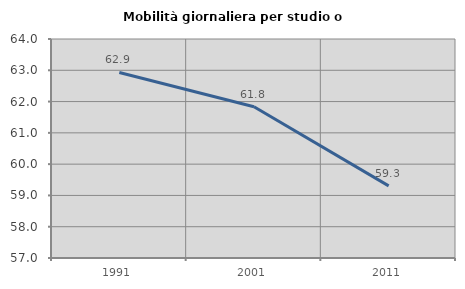
| Category | Mobilità giornaliera per studio o lavoro |
|---|---|
| 1991.0 | 62.93 |
| 2001.0 | 61.834 |
| 2011.0 | 59.307 |